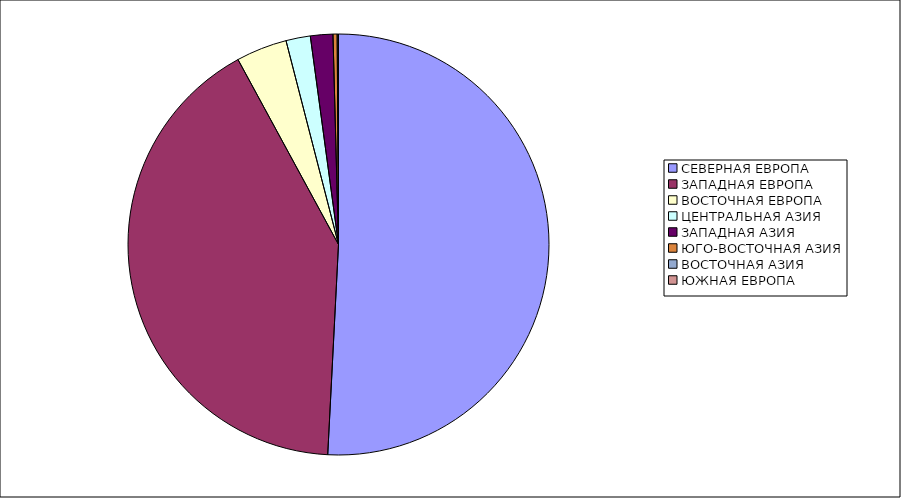
| Category | Оборот |
|---|---|
| СЕВЕРНАЯ ЕВРОПА | 50.815 |
| ЗАПАДНАЯ ЕВРОПА | 41.262 |
| ВОСТОЧНАЯ ЕВРОПА | 3.91 |
| ЦЕНТРАЛЬНАЯ АЗИЯ | 1.873 |
| ЗАПАДНАЯ АЗИЯ | 1.721 |
| ЮГО-ВОСТОЧНАЯ АЗИЯ | 0.319 |
| ВОСТОЧНАЯ АЗИЯ | 0.098 |
| ЮЖНАЯ ЕВРОПА | 0.001 |